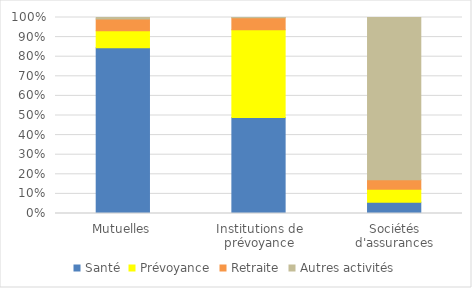
| Category | Santé | Prévoyance | Retraite | Autres activités |
|---|---|---|---|---|
| Mutuelles | 0.845 | 0.087 | 0.06 | 0.007 |
| Institutions de prévoyance | 0.49 | 0.448 | 0.062 | 0.001 |
| Sociétés d'assurances | 0.057 | 0.066 | 0.049 | 0.828 |